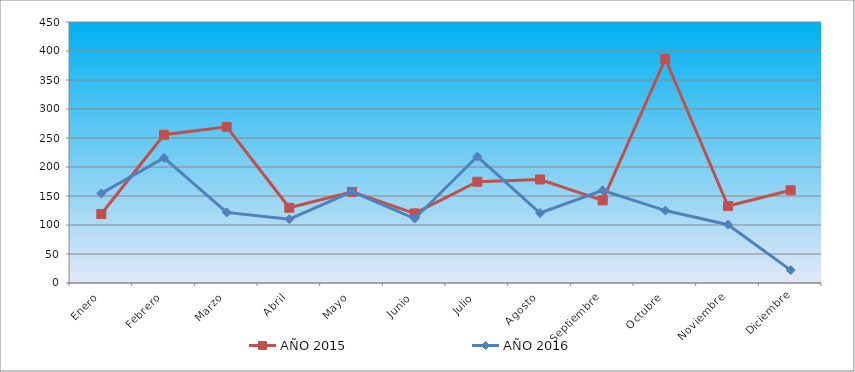
| Category | AÑO 2015 | AÑO 2016 |
|---|---|---|
| Enero | 119.006 | 154.437 |
| Febrero | 255.57 | 215.61 |
| Marzo | 269.226 | 121.724 |
| Abril | 129.736 | 110.081 |
| Mayo | 157.048 | 157.712 |
| Junio | 119.981 | 111.139 |
| Julio | 174.607 | 218.045 |
| Agosto | 178.508 | 120.666 |
| Septiembre | 142.417 | 159.829 |
| Octubre | 386.281 | 124.9 |
| Noviembre | 132.662 | 100.555 |
| Diciembre | 159.975 | 22.228 |